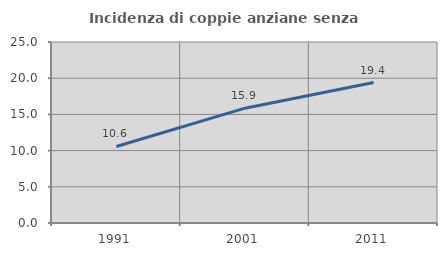
| Category | Incidenza di coppie anziane senza figli  |
|---|---|
| 1991.0 | 10.573 |
| 2001.0 | 15.859 |
| 2011.0 | 19.403 |